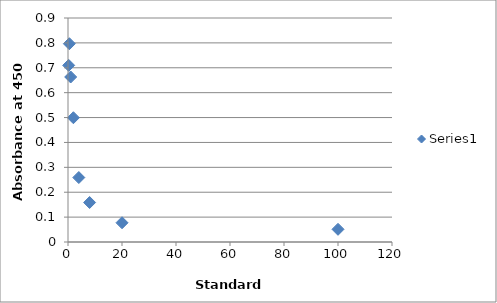
| Category | Series 0 |
|---|---|
| 100.0 | 0.051 |
| 20.0 | 0.077 |
| 8.0 | 0.159 |
| 4.0 | 0.259 |
| 2.0 | 0.499 |
| 1.0 | 0.663 |
| 0.5 | 0.797 |
| 0.25 | 0.71 |